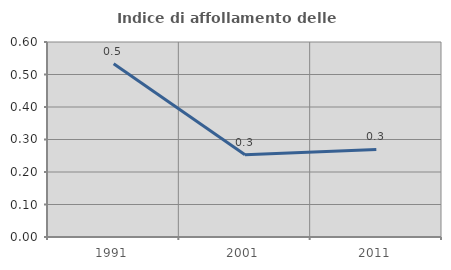
| Category | Indice di affollamento delle abitazioni  |
|---|---|
| 1991.0 | 0.533 |
| 2001.0 | 0.253 |
| 2011.0 | 0.27 |